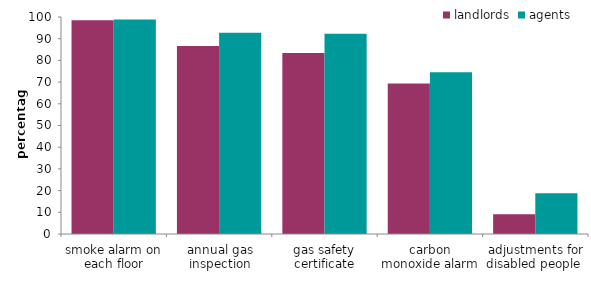
| Category | landlords | agents |
|---|---|---|
| smoke alarm on each floor | 98.533 | 98.903 |
| annual gas inspection | 86.677 | 92.734 |
| gas safety certificate | 83.39 | 92.24 |
| carbon monoxide alarm | 69.367 | 74.564 |
| adjustments for disabled people  | 9.082 | 18.797 |